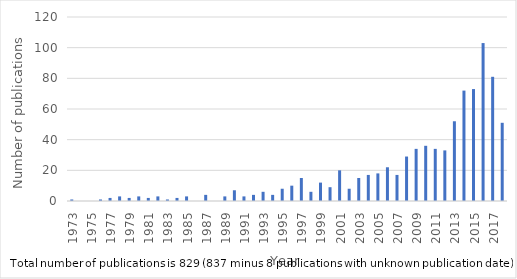
| Category | Count |
|---|---|
| 1973.0 | 1 |
| 1974.0 | 0 |
| 1975.0 | 0 |
| 1976.0 | 1 |
| 1977.0 | 2 |
| 1978.0 | 3 |
| 1979.0 | 2 |
| 1980.0 | 3 |
| 1981.0 | 2 |
| 1982.0 | 3 |
| 1983.0 | 1 |
| 1984.0 | 2 |
| 1985.0 | 3 |
| 1986.0 | 0 |
| 1987.0 | 4 |
| 1988.0 | 0 |
| 1989.0 | 3 |
| 1990.0 | 7 |
| 1991.0 | 3 |
| 1992.0 | 4 |
| 1993.0 | 6 |
| 1994.0 | 4 |
| 1995.0 | 8 |
| 1996.0 | 10 |
| 1997.0 | 15 |
| 1998.0 | 6 |
| 1999.0 | 12 |
| 2000.0 | 9 |
| 2001.0 | 20 |
| 2002.0 | 8 |
| 2003.0 | 15 |
| 2004.0 | 17 |
| 2005.0 | 18 |
| 2006.0 | 22 |
| 2007.0 | 17 |
| 2008.0 | 29 |
| 2009.0 | 34 |
| 2010.0 | 36 |
| 2011.0 | 34 |
| 2012.0 | 33 |
| 2013.0 | 52 |
| 2014.0 | 72 |
| 2015.0 | 73 |
| 2016.0 | 103 |
| 2017.0 | 81 |
| 2018.0 | 51 |